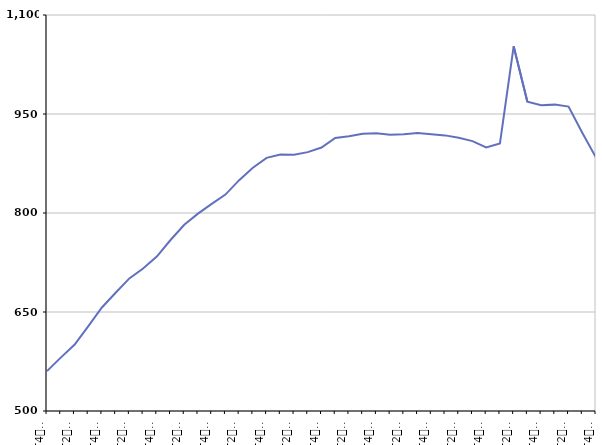
| Category | 50 ans ou plus |
|---|---|
| T4
2011 | 560.4 |
| T1
2012 | 580.9 |
| T2
2012 | 600.4 |
| T3
2012 | 628.3 |
| T4
2012 | 656.8 |
| T1
2013 | 679.2 |
| T2
2013 | 700.9 |
| T3
2013 | 715.9 |
| T4
2013 | 733.9 |
| T1
2014 | 759.1 |
| T2
2014 | 782.1 |
| T3
2014 | 799 |
| T4
2014 | 813.8 |
| T1
2015 | 827.9 |
| T2
2015 | 849.8 |
| T3
2015 | 868.5 |
| T4
2015 | 883.6 |
| T1
2016 | 888.6 |
| T2
2016 | 888.3 |
| T3
2016 | 892.2 |
| T4
2016 | 899.2 |
| T1
2017 | 913.8 |
| T2
2017 | 916.2 |
| T3
2017 | 920 |
| T4
2017 | 920.7 |
| T1
2018 | 918.4 |
| T2
2018 | 919.2 |
| T3
2018 | 921.1 |
| T4
2018 | 919.4 |
| T1
2019 | 917.6 |
| T2
2019 | 913.9 |
| T3
2019 | 908.9 |
| T4
2019 | 899.2 |
| T1
2020 | 905.2 |
| T2
2020 | 1052.5 |
| T3
2020 | 968.7 |
| T4
2020 | 963.3 |
| T1
2021 | 964.2 |
| T2
2021 | 961.2 |
| T3
2021 | 921.6 |
| T4
2021 | 884 |